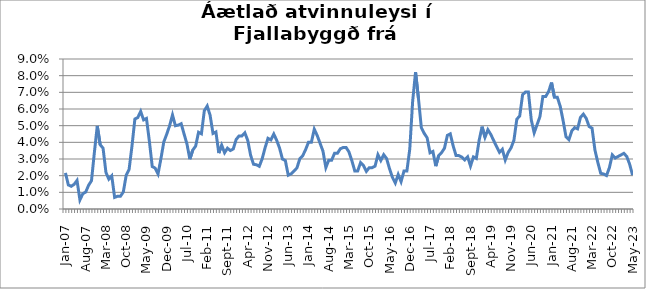
| Category | Series 0 |
|---|---|
| jan.07 | 0.022 |
| feb.07 | 0.014 |
| mar.07 | 0.014 |
| apr.07 | 0.015 |
| maí.07 | 0.017 |
| jún.07 | 0.005 |
| júl.07 | 0.009 |
| ágú.07 | 0.01 |
| sep.07 | 0.014 |
| okt.07 | 0.017 |
| nóv.07 | 0.034 |
| des.07 | 0.05 |
| jan.08 | 0.039 |
| feb.08 | 0.036 |
| mar.08 | 0.022 |
| apr.08 | 0.018 |
| maí.08 | 0.02 |
| jún.08 | 0.007 |
| júl.08 | 0.008 |
| ágú.08 | 0.008 |
| sep.08 | 0.01 |
| okt.08 | 0.02 |
| nóv.08 | 0.024 |
| des.08 | 0.038 |
| jan.09 | 0.054 |
| feb.09 | 0.055 |
| mar.09 | 0.059 |
| apr.09 | 0.053 |
| maí.09 | 0.054 |
| jún.09 | 0.041 |
| júl.09 | 0.025 |
| ágú.09 | 0.025 |
| sep.09 | 0.021 |
| okt.09 | 0.03 |
| nóv.09 | 0.04 |
| des.09 | 0.045 |
| jan.10 | 0.05 |
| feb.10 | 0.056 |
| mar.10 | 0.05 |
| apr.10 | 0.05 |
| maí.10 | 0.051 |
| jún.10 | 0.045 |
| júl.10 | 0.039 |
| ágú.10 | 0.03 |
| sep.10 | 0.035 |
| okt.10 | 0.038 |
| nóv.10 | 0.046 |
| des.10 | 0.045 |
| jan.11 | 0.059 |
| feb.11 | 0.062 |
| mar.11 | 0.056 |
| apr.11 | 0.045 |
| maí.11 | 0.046 |
| jún.11 | 0.034 |
| júl.11 | 0.038 |
| ágú.11 | 0.034 |
| sep.11 | 0.036 |
| okt.11 | 0.035 |
| nóv.11 | 0.036 |
| des.11 | 0.042 |
| jan.12 | 0.044 |
| feb.12 | 0.044 |
| mar.12 | 0.046 |
| apr.12 | 0.041 |
| maí.12 | 0.032 |
| jún.12 | 0.027 |
| júl.12 | 0.027 |
| ágú.12 | 0.026 |
| sep.12 | 0.03 |
| okt.12 | 0.037 |
| nóv.12 | 0.042 |
| des.12 | 0.041 |
| jan.13 | 0.045 |
| feb.13 | 0.041 |
| mar.13 | 0.037 |
| apr.13 | 0.03 |
| maí.13 | 0.029 |
| jún.13 | 0.02 |
| júl.13 | 0.021 |
| ágú.13 | 0.023 |
| sep.13 | 0.025 |
| okt.13 | 0.03 |
| nóv.13 | 0.032 |
| des.13 | 0.036 |
| jan.14 | 0.04 |
| feb.14 | 0.04 |
| mar.14 | 0.048 |
| apr.14 | 0.044 |
| maí.14 | 0.039 |
| jún.14 | 0.035 |
| júl.14 | 0.025 |
| ágú.14 | 0.029 |
| sep.14 | 0.029 |
| okt.14 | 0.033 |
| nóv.14 | 0.033 |
| des.14 | 0.036 |
| jan.15 | 0.037 |
| feb.15 | 0.037 |
| mar.15 | 0.034 |
| apr.15 | 0.029 |
| maí.15 | 0.023 |
| jún.15 | 0.023 |
| júl.15 | 0.028 |
| ágú.15 | 0.026 |
| sep.15 | 0.023 |
| okt.15 | 0.025 |
| nóv.15 | 0.025 |
| des.15 | 0.026 |
| jan.16 | 0.033 |
| feb.16 | 0.029 |
| mar.16 | 0.033 |
| apr.16 | 0.03 |
| maí.16 | 0.024 |
| jún.16 | 0.019 |
| júl.16 | 0.016 |
| ágú.16 | 0.021 |
| sep.16 | 0.016 |
| okt.16 | 0.023 |
| nóv.16 | 0.023 |
| des.16 | 0.036 |
| jan.17 | 0.065 |
| feb.17 | 0.082 |
| mar.17 | 0.066 |
| apr.17 | 0.049 |
| maí.17 | 0.045 |
| jún.17 | 0.043 |
| júl.17 | 0.034 |
| ágú.17 | 0.035 |
| sep.17 | 0.026 |
| okt.17 | 0.032 |
| nóv.17 | 0.034 |
| des.17 | 0.037 |
| jan.18 | 0.044 |
| feb.18 | 0.045 |
| mar.18 | 0.038 |
| apr.18 | 0.032 |
| maí.18 | 0.032 |
| jún.18 | 0.031 |
| júl.18 | 0.029 |
| ágú.18 | 0.031 |
| sep.18 | 0.026 |
| okt.18 | 0.031 |
| nóv.18 | 0.03 |
| des.18 | 0.041 |
| jan.19 | 0.049 |
| feb.19 | 0.043 |
| mar.19 | 0.048 |
| apr.19 | 0.045 |
| maí.19 | 0.041 |
| jún.19 | 0.037 |
| júl.19 | 0.034 |
| ágú.19 | 0.036 |
| sep.19 | 0.029 |
| okt.19 | 0.034 |
| nóv.19 | 0.037 |
| des.19 | 0.041 |
| jan.20 | 0.054 |
| feb.20 | 0.056 |
| mar. 20*** | 0.069 |
| apr.20 | 0.07 |
| maí.20 | 0.07 |
| jún.20 | 0.053 |
| júl.20 | 0.046 |
| ágú.20 | 0.051 |
| sep.20 | 0.055 |
| okt.20 | 0.068 |
| nóv.20 | 0.068 |
| des.20 | 0.071 |
| jan.21 | 0.076 |
| feb.21 | 0.067 |
| mar.21 | 0.067 |
| apr.21 | 0.062 |
| maí.21 | 0.053 |
| jún.21 | 0.043 |
| júl.21 | 0.042 |
| ágú.21 | 0.047 |
| sep.21 | 0.049 |
| okt.21 | 0.048 |
| nóv.21 | 0.055 |
| des.21 | 0.057 |
| jan.22 | 0.054 |
| feb.22 | 0.049 |
| mar.22 | 0.048 |
| apr.22 | 0.035 |
| maí.22 | 0.028 |
| jún.22 | 0.021 |
| júl.22 | 0.021 |
| ágú.22 | 0.02 |
| sep.22 | 0.025 |
| okt.22 | 0.032 |
| nóv.22 | 0.031 |
| des.22 | 0.032 |
| jan.23 | 0.032 |
| feb.23 | 0.033 |
| mar.23 | 0.031 |
| apr.23 | 0.027 |
| maí.23 | 0.02 |